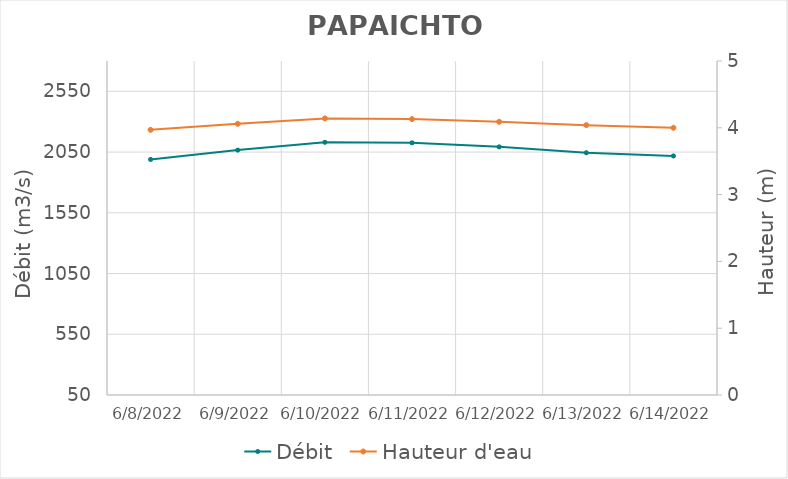
| Category | Débit |
|---|---|
| 4/26/22 | 2520 |
| 4/25/22 | 2444.07 |
| 4/24/22 | 2357.18 |
| 4/23/22 | 2261.72 |
| 4/22/22 | 2173.01 |
| 4/21/22 | 2087.87 |
| 4/20/22 | 2103.22 |